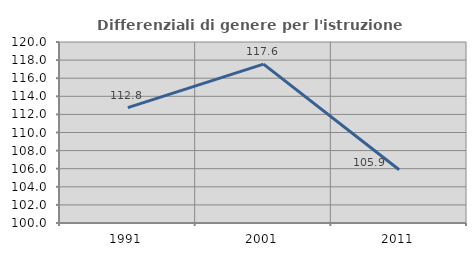
| Category | Differenziali di genere per l'istruzione superiore |
|---|---|
| 1991.0 | 112.756 |
| 2001.0 | 117.552 |
| 2011.0 | 105.889 |